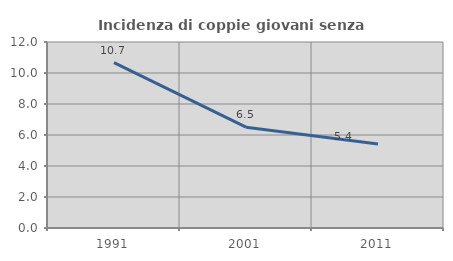
| Category | Incidenza di coppie giovani senza figli |
|---|---|
| 1991.0 | 10.669 |
| 2001.0 | 6.505 |
| 2011.0 | 5.425 |